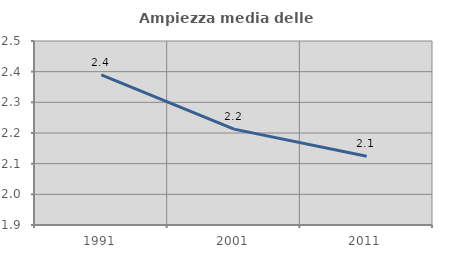
| Category | Ampiezza media delle famiglie |
|---|---|
| 1991.0 | 2.389 |
| 2001.0 | 2.213 |
| 2011.0 | 2.124 |